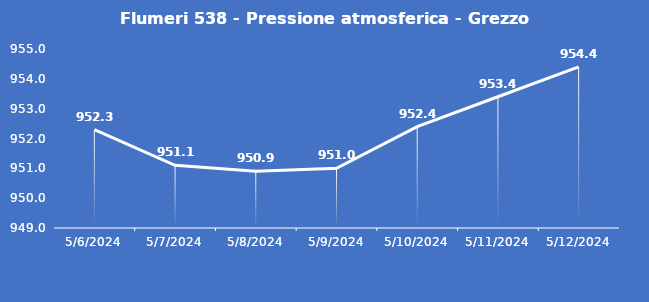
| Category | Flumeri 538 - Pressione atmosferica - Grezzo (hPa) |
|---|---|
| 5/6/24 | 952.3 |
| 5/7/24 | 951.1 |
| 5/8/24 | 950.9 |
| 5/9/24 | 951 |
| 5/10/24 | 952.4 |
| 5/11/24 | 953.4 |
| 5/12/24 | 954.4 |